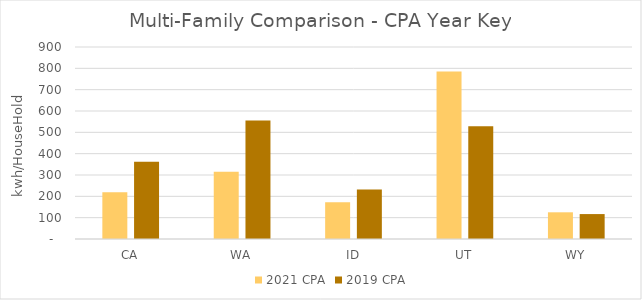
| Category | 2021 CPA | 2019 CPA |
|---|---|---|
|  CA  | 218.583 | 361.778 |
|  WA  | 314.728 | 555.613 |
|  ID  | 172.341 | 231.985 |
|  UT  | 784.717 | 528.049 |
|  WY  | 125.156 | 116.839 |